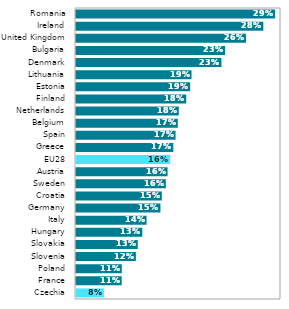
| Category | Series 0 |
|---|---|
| Czechia | 0.084 |
| France | 0.106 |
| Poland | 0.106 |
| Slovenia | 0.123 |
| Slovakia | 0.125 |
| Hungary | 0.131 |
| Italy | 0.136 |
| Germany | 0.153 |
| Croatia | 0.155 |
| Sweden | 0.16 |
| Austria | 0.162 |
| EU28 | 0.165 |
| Greece | 0.169 |
| Spain | 0.171 |
| Belgium | 0.174 |
| Netherlands | 0.175 |
| Finland | 0.184 |
| Estonia | 0.189 |
| Lithuania | 0.191 |
| Denmark | 0.227 |
| Bulgaria | 0.232 |
| United Kingdom | 0.257 |
| Ireland | 0.278 |
| Romania | 0.293 |